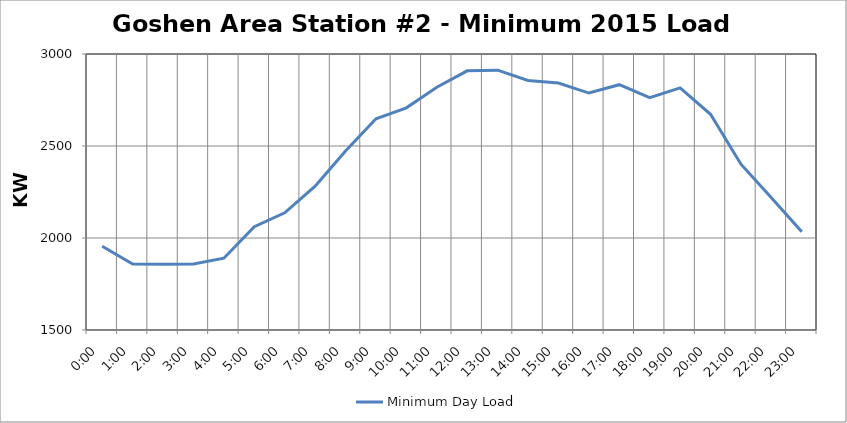
| Category | Minimum Day Load |
|---|---|
| 0.0 | 1954.75 |
| 0.041666666666666664 | 1858.5 |
| 0.08333333333333333 | 1856.75 |
| 0.125 | 1858.5 |
| 0.16666666666666666 | 1890 |
| 0.20833333333333334 | 2061.5 |
| 0.25 | 2136.75 |
| 0.2916666666666667 | 2282 |
| 0.3333333333333333 | 2472.75 |
| 0.375 | 2647.75 |
| 0.4166666666666667 | 2707.25 |
| 0.4583333333333333 | 2819.25 |
| 0.5 | 2908.5 |
| 0.5416666666666666 | 2912 |
| 0.5833333333333334 | 2856 |
| 0.625 | 2842 |
| 0.6666666666666666 | 2787.75 |
| 0.7083333333333334 | 2833.25 |
| 0.75 | 2763.25 |
| 0.7916666666666666 | 2815.75 |
| 0.8333333333333334 | 2672.25 |
| 0.875 | 2401 |
| 0.9166666666666666 | 2219 |
| 0.9583333333333334 | 2033.5 |